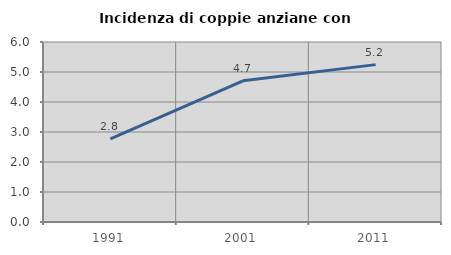
| Category | Incidenza di coppie anziane con figli |
|---|---|
| 1991.0 | 2.773 |
| 2001.0 | 4.708 |
| 2011.0 | 5.246 |